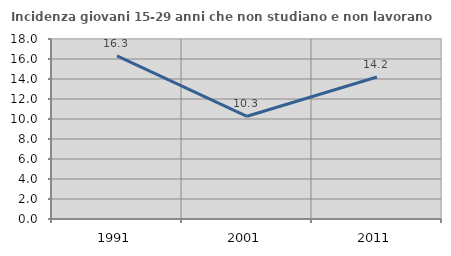
| Category | Incidenza giovani 15-29 anni che non studiano e non lavorano  |
|---|---|
| 1991.0 | 16.306 |
| 2001.0 | 10.272 |
| 2011.0 | 14.2 |